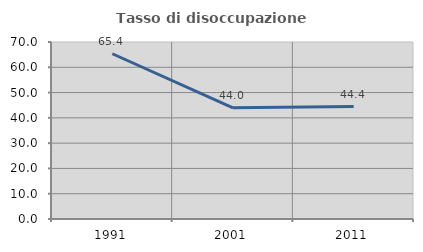
| Category | Tasso di disoccupazione giovanile  |
|---|---|
| 1991.0 | 65.352 |
| 2001.0 | 43.956 |
| 2011.0 | 44.444 |